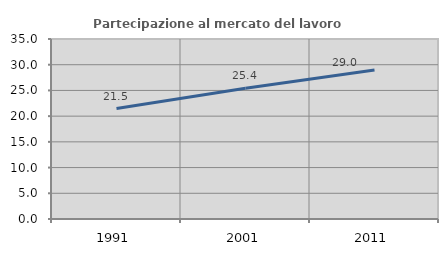
| Category | Partecipazione al mercato del lavoro  femminile |
|---|---|
| 1991.0 | 21.466 |
| 2001.0 | 25.421 |
| 2011.0 | 28.988 |